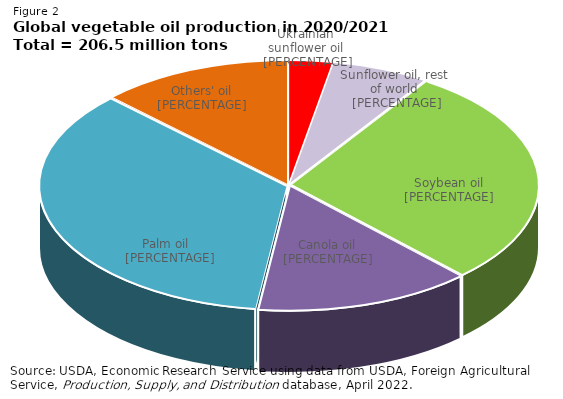
| Category | Series 0 |
|---|---|
| Ukrainian sunflower oil | 5.913 |
| Sunflower oil, rest of world | 13.157 |
| Soybean oil  | 59.155 |
| Canola oil  | 29.217 |
| Palm oil  | 73.105 |
| Others' oil | 25.96 |